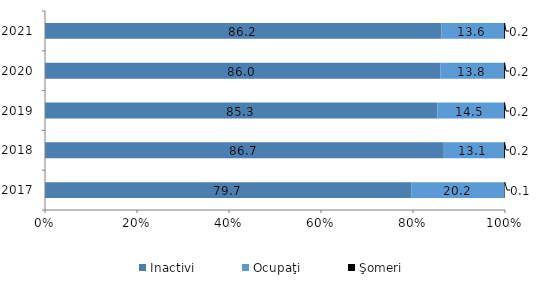
| Category | Inactivi | Ocupaţi | Şomeri |
|---|---|---|---|
| 2017.0 | 79.7 | 20.2 | 0.1 |
| 2018.0 | 86.7 | 13.1 | 0.2 |
| 2019.0 | 85.3 | 14.5 | 0.2 |
| 2020.0 | 86 | 13.8 | 0.2 |
| 2021.0 | 86.2 | 13.6 | 0.2 |